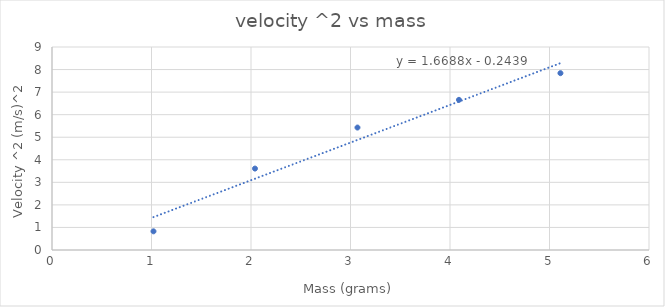
| Category | velocity ^2 (m/s)^2 |
|---|---|
| 1.02 | 0.828 |
| 2.04 | 3.61 |
| 3.07 | 5.429 |
| 4.09 | 6.656 |
| 5.11 | 7.84 |